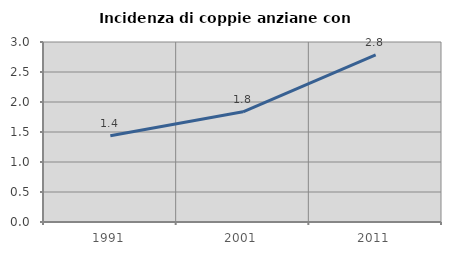
| Category | Incidenza di coppie anziane con figli |
|---|---|
| 1991.0 | 1.438 |
| 2001.0 | 1.836 |
| 2011.0 | 2.786 |